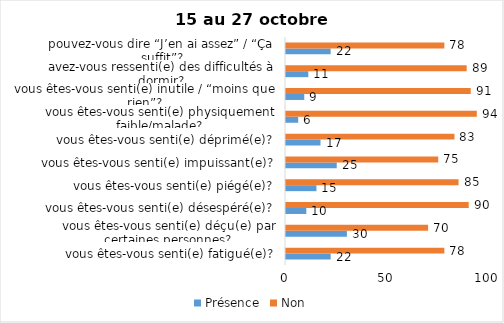
| Category | Présence | Non |
|---|---|---|
| vous êtes-vous senti(e) fatigué(e)? | 22 | 78 |
| vous êtes-vous senti(e) déçu(e) par certaines personnes? | 30 | 70 |
| vous êtes-vous senti(e) désespéré(e)? | 10 | 90 |
| vous êtes-vous senti(e) piégé(e)? | 15 | 85 |
| vous êtes-vous senti(e) impuissant(e)? | 25 | 75 |
| vous êtes-vous senti(e) déprimé(e)? | 17 | 83 |
| vous êtes-vous senti(e) physiquement faible/malade? | 6 | 94 |
| vous êtes-vous senti(e) inutile / “moins que rien”? | 9 | 91 |
| avez-vous ressenti(e) des difficultés à dormir? | 11 | 89 |
| pouvez-vous dire “J’en ai assez” / “Ça suffit”? | 22 | 78 |